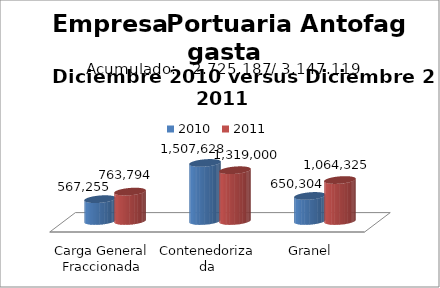
| Category | 2010 | 2011 |
|---|---|---|
| Carga General Fraccionada | 567255 | 763794.438 |
| Contenedorizada | 1507628 | 1318999.567 |
| Granel | 650304 | 1064324.946 |